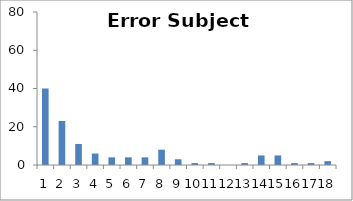
| Category | Sub10 |
|---|---|
| 0 | 40 |
| 1 | 23 |
| 2 | 11 |
| 3 | 6 |
| 4 | 4 |
| 5 | 4 |
| 6 | 4 |
| 7 | 8 |
| 8 | 3 |
| 9 | 1 |
| 10 | 1 |
| 11 | 0 |
| 12 | 1 |
| 13 | 5 |
| 14 | 5 |
| 15 | 1 |
| 16 | 1 |
| 17 | 2 |